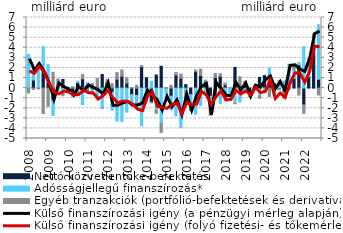
| Category | Nettó közvetlentőke-befektetés | Adósságjellegű finanszírozás* | Egyéb tranzakciók (portfólió-befektetések és derivatívák) |
|---|---|---|---|
| 2008.0 | -0.033 | 3.349 | -0.445 |
| 2008.0 | 0.803 | 1.088 | -0.143 |
| 2008.0 | -0.018 | 2.453 | -0.057 |
| 2008.0 | 1.693 | 2.442 | -2.531 |
| 2009.0 | 0.563 | 1.76 | -1.808 |
| 2009.0 | -1.245 | -1.481 | 1.555 |
| 2009.0 | 0.091 | -0.441 | 0.803 |
| 2009.0 | 0.849 | -0.524 | -0.23 |
| 2010.0 | -0.209 | 0.064 | 0.002 |
| 2010.0 | -0.422 | -0.45 | 0.129 |
| 2010.0 | 0.55 | 0.133 | -0.583 |
| 2010.0 | 0.916 | -1.641 | 0.426 |
| 2011.0 | 0.212 | 0.326 | -0.276 |
| 2011.0 | -0.157 | -0.266 | 0.447 |
| 2011.0 | -0.329 | -0.835 | 0.948 |
| 2011.0 | 1.349 | -1.961 | -0.027 |
| 2012.0 | 0.56 | -0.353 | 0.275 |
| 2012.0 | -0.417 | -1.763 | 0.435 |
| 2012.0 | 0.874 | -3.272 | 0.657 |
| 2012.0 | 1.166 | -3.304 | 0.621 |
| 2013.0 | 0.497 | -2.385 | 0.521 |
| 2013.0 | -0.651 | -1.108 | 0.016 |
| 2013.0 | -0.73 | -1.279 | 0.283 |
| 2013.0 | 2.115 | -3.746 | 0.106 |
| 2014.0 | 1.023 | -0.891 | -0.381 |
| 2014.0 | -1.403 | 0.662 | -0.06 |
| 2014.0 | 1.296 | -2.179 | -0.328 |
| 2014.0 | 2.162 | -3.495 | -0.903 |
| 2015.0 | -0.029 | -0.895 | 0.05 |
| 2015.0 | -0.806 | -1.363 | 0.273 |
| 2015.0 | 1.293 | -2.748 | 0.242 |
| 2015.0 | 0.981 | -3.918 | 0.413 |
| 2016.0 | 0.34 | -0.282 | -0.707 |
| 2016.0 | -0.651 | -1.305 | -0.283 |
| 2016.0 | 1.63 | -2.575 | 0.164 |
| 2016.0 | 1.244 | -1.739 | 0.616 |
| 2017.0 | 0.616 | -0.382 | 0.171 |
| 2017.0 | -0.797 | -1.326 | -0.56 |
| 2017.0 | 1.054 | -0.941 | 0.4 |
| 2017.0 | 1.164 | -1.523 | 0.258 |
| 2018.0 | 0.329 | -1.244 | 0.168 |
| 2018.0 | 0 | -0.633 | -0.193 |
| 2018.0 | 2.05 | -1.506 | -0.041 |
| 2018.0 | 0.233 | -1.376 | 0.896 |
| 2019.0 | 0.383 | -0.202 | 0.289 |
| 2019.0 | -0.588 | -0.016 | -0.247 |
| 2019.0 | 0.099 | 0.136 | 0.012 |
| 2019.0 | 1.061 | -0.786 | -0.229 |
| 2020.0 | 1.242 | -0.348 | -0.1 |
| 2020.0 | 0.774 | 1.21 | -0.836 |
| 2020.0 | 0.451 | -0.418 | -0.134 |
| 2020.0 | -0.117 | 0.77 | -0.046 |
| 2021.0 | -0.36 | 0.704 | -0.634 |
| 2021.0 | 0.056 | 2.314 | -0.167 |
| 2021.0 | 0.952 | 0.855 | 0.452 |
| 2021.0 | 2.311 | 0.222 | -0.691 |
| 2022.0 | -1.654 | 4.107 | -0.847 |
| 2022.0 | 1.127 | 1.02 | 0.754 |
| 2022.0 | 3.522 | 0.486 | 1.348 |
| 2022.0 | 0.88 | 5.399 | -0.682 |